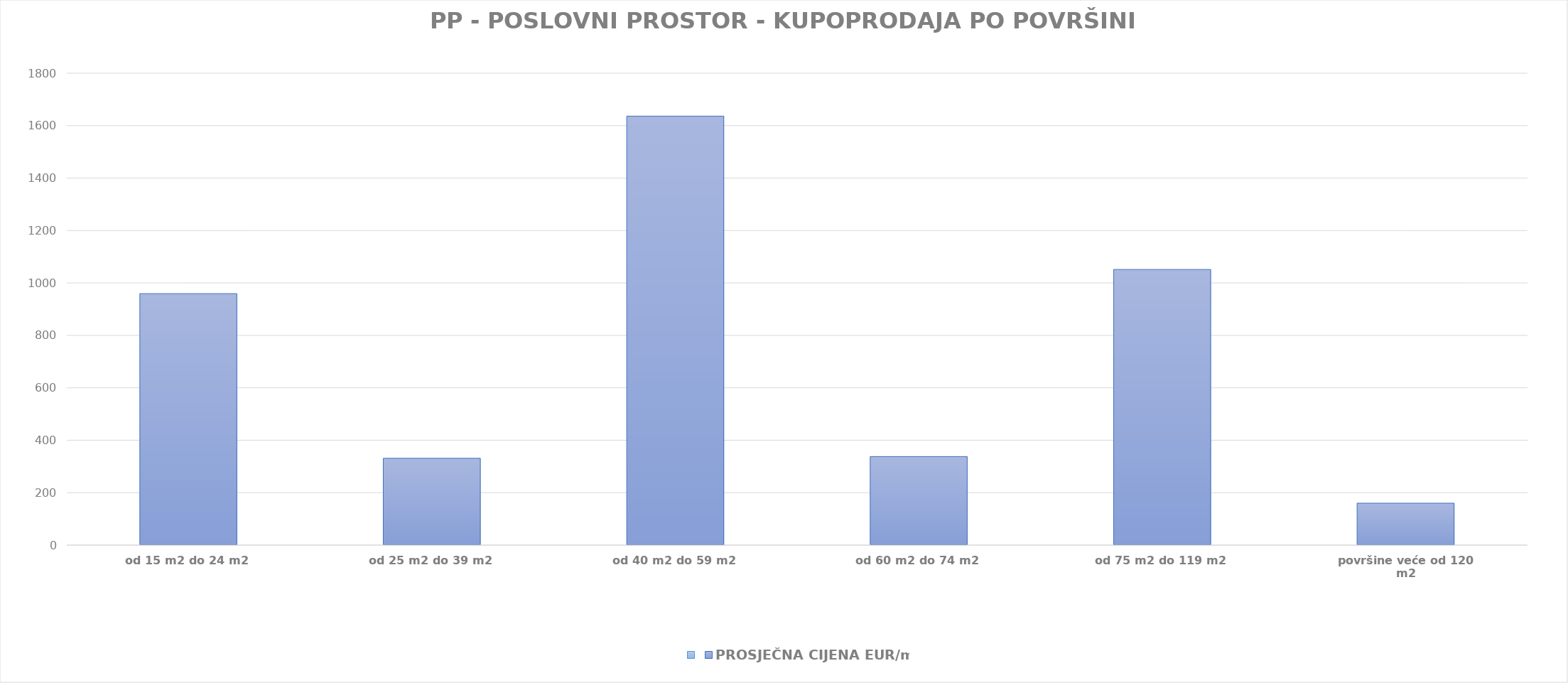
| Category | Series 0 | PROSJEČNA CIJENA EUR/m2 |
|---|---|---|
| od 15 m2 do 24 m2 |  | 1902-08-16 06:19:17 |
| od 25 m2 do 39 m2 |  | 1900-11-26 03:01:11 |
| od 40 m2 do 59 m2 |  | 1904-06-23 08:43:38 |
| od 60 m2 do 74 m2 |  | 1900-12-02 20:22:38 |
| od 75 m2 do 119 m2 |  | 1902-11-16 09:18:49 |
| površine veće od 120 m2 |  | 1900-06-08 01:29:59 |